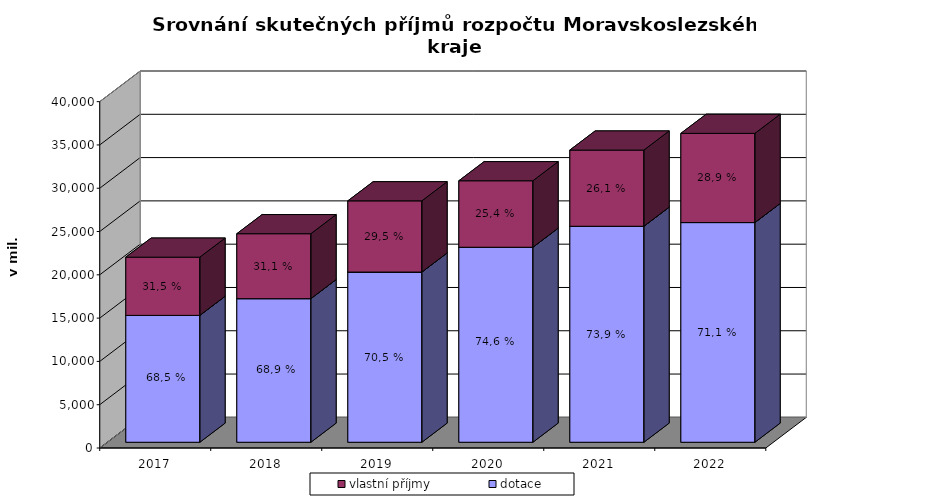
| Category | dotace | vlastní příjmy |
|---|---|---|
| 2017.0 | 14651.604 | 6723.521 |
| 2018.0 | 16584.967 | 7499.883 |
| 2019.0 | 19656.418 | 8223.054 |
| 2020.0 | 22521.791 | 7678.534 |
| 2021.0 | 24944.618 | 8799.483 |
| 2022.0 | 25373.744 | 10299.962 |